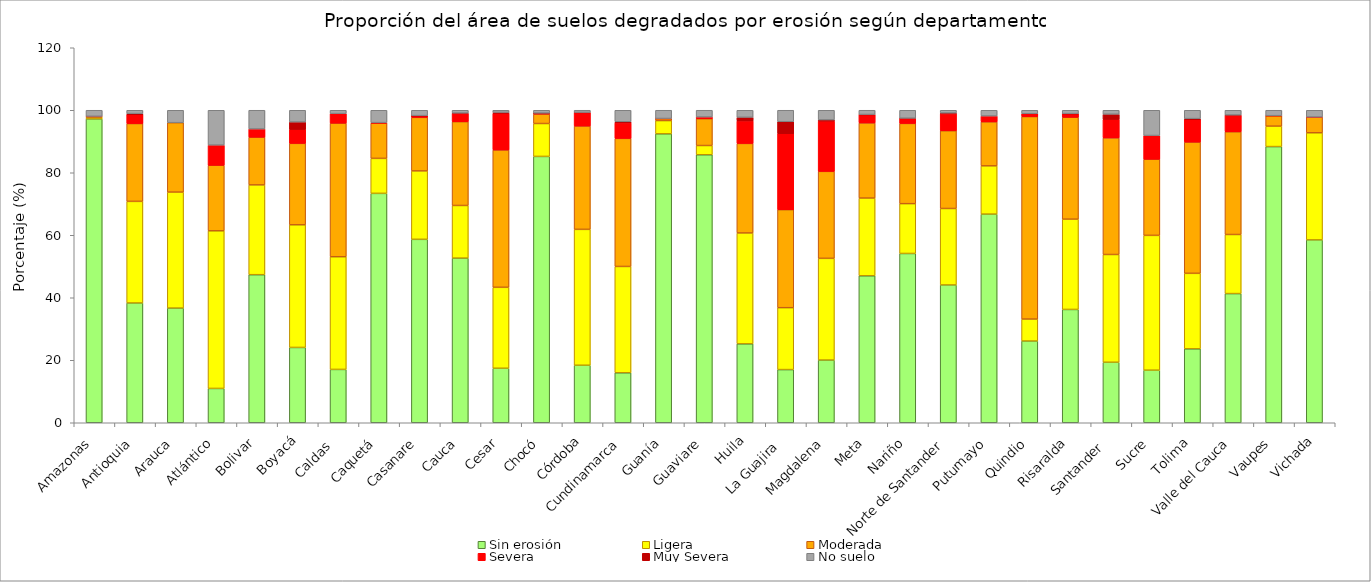
| Category | Sin erosión | Ligera | Moderada | Severa | Muy Severa | No suelo |
|---|---|---|---|---|---|---|
| Amazonas | 97.224 | 0.561 | 0.255 | 0.022 | 0 | 1.938 |
| Antioquia | 38.329 | 32.51 | 24.898 | 2.85 | 0.343 | 1.069 |
| Arauca | 36.699 | 37.095 | 22.227 | 0 | 0 | 3.979 |
| Atlántico | 10.983 | 50.424 | 20.992 | 6.448 | 0 | 11.154 |
| Bolivar | 47.379 | 28.724 | 15.289 | 2.617 | 0 | 5.992 |
| Boyacá | 24.096 | 39.238 | 26.074 | 4.439 | 2.385 | 3.769 |
| Caldas  | 17.069 | 36.041 | 42.773 | 3.046 | 0 | 1.072 |
| Caquetá | 73.408 | 11.188 | 11.294 | 0.146 | 0 | 3.964 |
| Casanare | 58.697 | 21.884 | 17.149 | 0.554 | 0.001 | 1.716 |
| Cauca | 52.689 | 16.833 | 26.816 | 2.676 | 0.094 | 0.892 |
| Cesar | 17.443 | 25.9 | 43.954 | 11.762 | 0.268 | 0.673 |
| Chocó | 85.228 | 10.522 | 3.045 | 0.302 | 0.001 | 0.902 |
| Córdoba | 18.401 | 43.483 | 33.078 | 4.312 | 0.048 | 0.68 |
| Cundinamarca | 15.986 | 34.021 | 40.99 | 4.972 | 0.341 | 3.689 |
| Guanía | 92.456 | 4.227 | 0.677 | 0.003 | 0 | 2.638 |
| Guaviare | 85.755 | 2.954 | 8.573 | 0.559 | 0 | 2.159 |
| Huila | 25.252 | 35.472 | 28.654 | 7.21 | 1.153 | 2.259 |
| La Guajira  | 17.014 | 19.798 | 31.372 | 24.322 | 3.821 | 3.674 |
| Magdalena | 20.06 | 32.546 | 27.834 | 16.097 | 0.381 | 3.082 |
| Meta | 47.029 | 24.864 | 24.054 | 2.684 | 0.011 | 1.358 |
| Nariño | 54.165 | 15.937 | 25.68 | 1.618 | 0.057 | 2.544 |
| Norte de Santander | 44.095 | 24.46 | 24.881 | 5.414 | 0.271 | 0.878 |
| Putumayo | 66.767 | 15.431 | 14.092 | 1.866 | 0 | 1.843 |
| Quindio | 26.153 | 7.017 | 64.797 | 0.917 | 0 | 1.116 |
| Risaralda | 36.258 | 28.877 | 32.627 | 1.153 | 0.011 | 1.073 |
| Santander  | 19.363 | 34.471 | 37.325 | 5.917 | 1.653 | 1.271 |
| Sucre | 16.83 | 43.128 | 24.378 | 7.576 | 0 | 8.089 |
| Tolima | 23.658 | 24.153 | 42.012 | 7.17 | 0.329 | 2.678 |
| Valle del Cauca | 41.334 | 18.899 | 32.872 | 5.354 | 0.022 | 1.519 |
| Vaupes | 88.373 | 6.53 | 3.352 | 0.01 | 0 | 1.735 |
| Vichada | 58.518 | 34.259 | 5.047 | 0.006 | 0 | 2.169 |